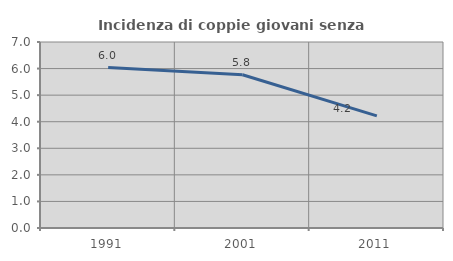
| Category | Incidenza di coppie giovani senza figli |
|---|---|
| 1991.0 | 6.039 |
| 2001.0 | 5.769 |
| 2011.0 | 4.219 |